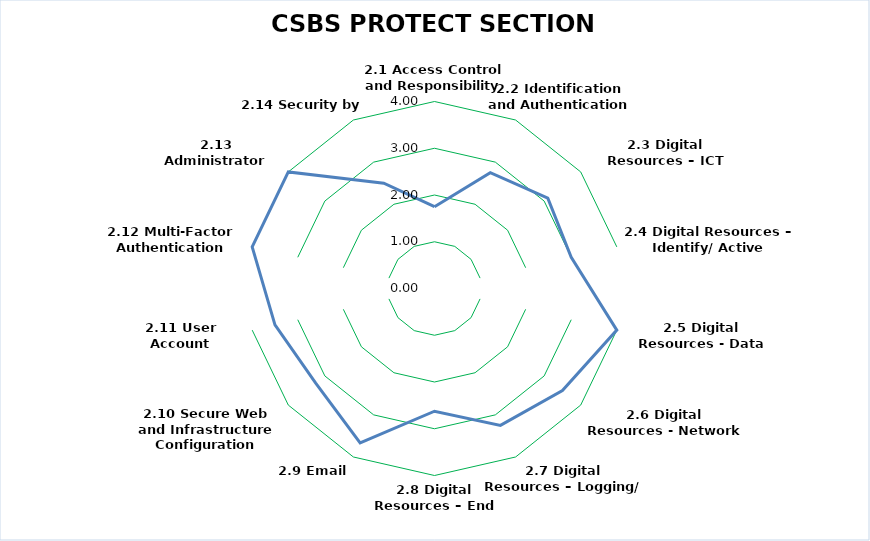
| Category | CSBS PROTECT SECTION SUMMARY(PR) |
|---|---|
| 2.1 Access Control and Responsibility | 1.75 |
| 2.2 Identification and Authentication | 2.75 |
| 2.3 Digital Resources – ICT Digital Resources | 3.1 |
| 2.4 Digital Resources – Identify/ Active Directory | 3 |
| 2.5 Digital Resources - Data | 4 |
| 2.6 Digital Resources - Network | 3.5 |
| 2.7 Digital Resources – Logging/ Auditing | 3.25 |
| 2.8 Digital Resources – End point Devices | 2.625 |
| 2.9 Email Security | 3.667 |
| 2.10 Secure Web and Infrastructure Configuration | 3.25 |
| 2.11 User Account Protection | 3.5 |
| 2.12 Multi-Factor Authentication (MFA) | 4 |
| 2.13 Administrator Training | 4 |
| 2.14 Security by Design | 2.5 |